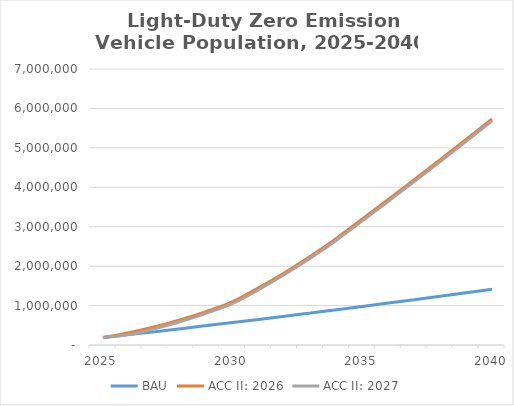
| Category | BAU | ACC II: 2026 | ACC II: 2027 |
|---|---|---|---|
| 2025.0 | 188166.103 | 188166.103 | 188166.103 |
| 2026.0 | 263025.894 | 310030.879 | 263025.894 |
| 2027.0 | 338645.352 | 461269.796 | 414264.811 |
| 2028.0 | 415018.714 | 642434.514 | 595429.529 |
| 2029.0 | 492140.213 | 854070.255 | 807065.27 |
| 2030.0 | 570004.085 | 1100337.386 | 1053332.401 |
| 2031.0 | 649140.857 | 1450011.495 | 1403006.51 |
| 2032.0 | 729555.725 | 1833384.701 | 1786379.716 |
| 2033.0 | 811253.884 | 2251375.282 | 2204370.297 |
| 2034.0 | 894240.53 | 2704906.953 | 2657901.968 |
| 2035.0 | 978520.859 | 3194908.866 | 3147903.881 |
| 2036.0 | 1063787.897 | 3690647.46 | 3643642.475 |
| 2037.0 | 1150041.644 | 4192122.734 | 4145117.749 |
| 2038.0 | 1237282.1 | 4699334.688 | 4652329.703 |
| 2039.0 | 1325509.266 | 5212283.323 | 5165278.338 |
| 2040.0 | 1414723.14 | 5730968.638 | 5683963.653 |